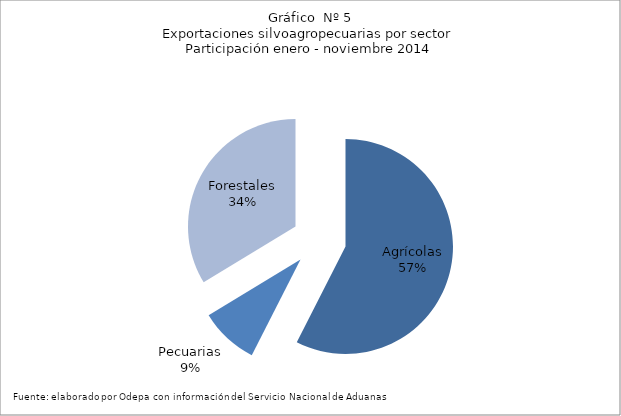
| Category | Series 0 |
|---|---|
| Agrícolas | 8335396 |
| Pecuarias | 1278317 |
| Forestales | 4885901 |